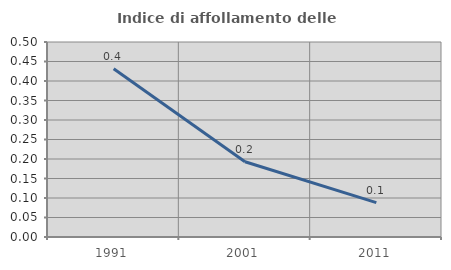
| Category | Indice di affollamento delle abitazioni  |
|---|---|
| 1991.0 | 0.431 |
| 2001.0 | 0.193 |
| 2011.0 | 0.088 |